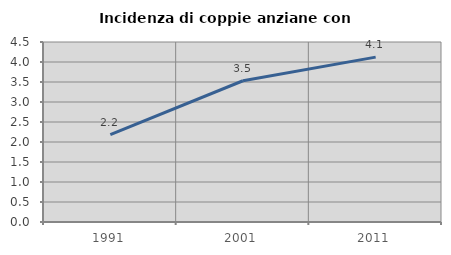
| Category | Incidenza di coppie anziane con figli |
|---|---|
| 1991.0 | 2.184 |
| 2001.0 | 3.531 |
| 2011.0 | 4.122 |